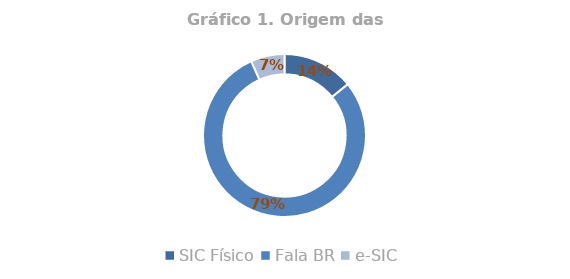
| Category | Total |
|---|---|
| SIC Físico | 0.142 |
| Fala BR | 0.791 |
| e-SIC | 0.067 |